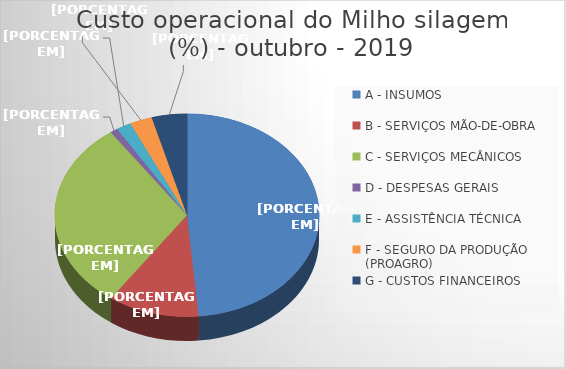
| Category | Series 0 |
|---|---|
| A - INSUMOS | 48.591 |
| B - SERVIÇOS MÃO-DE-OBRA | 11.136 |
| C - SERVIÇOS MECÂNICOS | 30.507 |
| D - DESPESAS GERAIS  | 0.902 |
| E - ASSISTÊNCIA TÉCNICA | 1.823 |
| F - SEGURO DA PRODUÇÃO (PROAGRO) | 2.734 |
| G - CUSTOS FINANCEIROS | 4.306 |